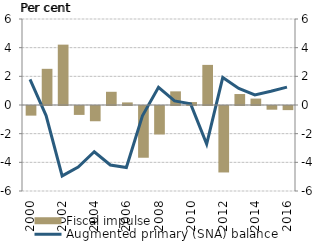
| Category | Fiscal impulse |
|---|---|
| 2000-01-01 | -0.672 |
| 2001-01-01 | 2.524 |
| 2002-01-01 | 4.211 |
| 2003-01-01 | -0.622 |
| 2004-01-01 | -1.064 |
| 2005-01-01 | 0.922 |
| 2006-01-01 | 0.18 |
| 2007-01-01 | -3.61 |
| 2008-01-01 | -1.989 |
| 2009-01-01 | 0.952 |
| 2010-01-01 | 0.204 |
| 2011-01-01 | 2.798 |
| 2012-01-01 | -4.637 |
| 2013-01-01 | 0.765 |
| 2014-01-01 | 0.448 |
| 2015-01-01 | -0.258 |
| 2016-01-01 | -0.287 |